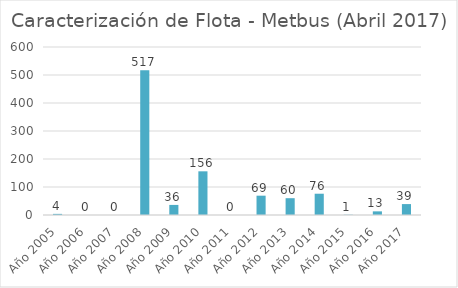
| Category | Series 0 |
|---|---|
| Año 2005 | 4 |
| Año 2006 | 0 |
| Año 2007 | 0 |
| Año 2008 | 517 |
| Año 2009 | 36 |
| Año 2010 | 156 |
| Año 2011 | 0 |
| Año 2012 | 69 |
| Año 2013 | 60 |
| Año 2014 | 76 |
| Año 2015 | 1 |
| Año 2016 | 13 |
| Año 2017 | 39 |